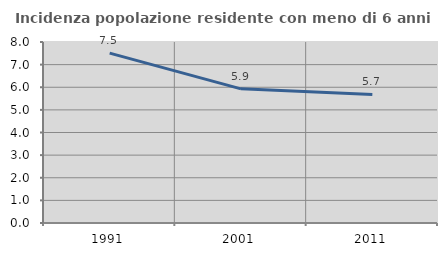
| Category | Incidenza popolazione residente con meno di 6 anni |
|---|---|
| 1991.0 | 7.507 |
| 2001.0 | 5.929 |
| 2011.0 | 5.684 |